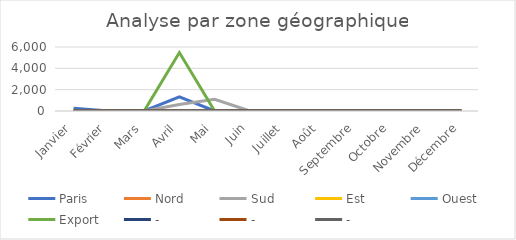
| Category | Paris | Nord | Sud | Est | Ouest | Export | - |
|---|---|---|---|---|---|---|---|
| Janvier | 258 | 0 | 0 | 0 | 0 | 0 | 0 |
| Février | 0 | 0 | 0 | 0 | 0 | 0 | 0 |
| Mars | 0 | 0 | 0 | 0 | 0 | 0 | 0 |
| Avril | 1330 | 0 | 612 | 0 | 0 | 5477 | 0 |
| Mai | 0 | 0 | 1102 | 0 | 0 | 0 | 0 |
| Juin | 0 | 0 | 0 | 0 | 0 | 0 | 0 |
| Juillet | 0 | 0 | 0 | 0 | 0 | 0 | 0 |
| Août | 0 | 0 | 0 | 0 | 0 | 0 | 0 |
| Septembre | 0 | 0 | 0 | 0 | 0 | 0 | 0 |
| Octobre | 0 | 0 | 0 | 0 | 0 | 0 | 0 |
| Novembre | 0 | 0 | 0 | 0 | 0 | 0 | 0 |
| Décembre | 0 | 0 | 0 | 0 | 0 | 0 | 0 |